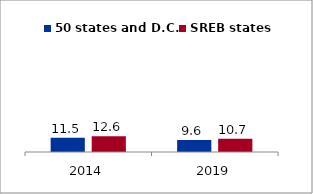
| Category | 50 states and D.C. | SREB states |
|---|---|---|
| 2014.0 | 11.511 | 12.613 |
| 2019.0 | 9.593 | 10.711 |